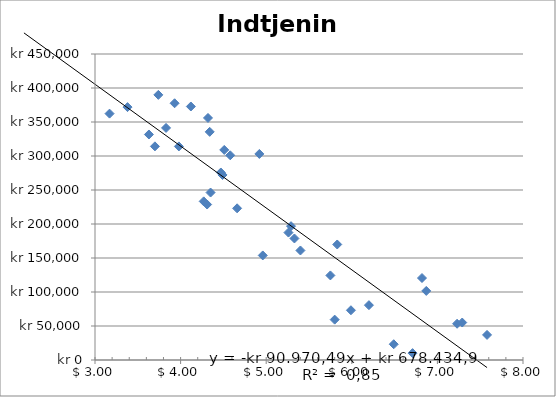
| Category | Indtjening |
|---|---|
| 7.23 | 53306 |
| 6.71 | 10131 |
| 6.49 | 23175 |
| 7.58 | 36888 |
| 7.29 | 55106 |
| 5.99 | 73177 |
| 5.8 | 59362 |
| 6.82 | 120555 |
| 6.87 | 101578 |
| 6.2 | 80640 |
| 5.83 | 169873 |
| 5.75 | 124362 |
| 4.96 | 153757 |
| 5.26 | 187387 |
| 5.4 | 161068 |
| 5.33 | 178734 |
| 4.66 | 223064 |
| 5.29 | 196829 |
| 4.35 | 246260 |
| 4.51 | 308921 |
| 4.31 | 228649 |
| 3.98 | 314065 |
| 3.7 | 314181 |
| 3.38 | 371908 |
| 3.93 | 377566 |
| 4.47 | 275740 |
| 4.58 | 301016 |
| 3.63 | 331629 |
| 4.92 | 303011 |
| 4.27 | 233286 |
| 4.32 | 355934 |
| 4.49 | 272118 |
| 4.34 | 335522 |
| 3.83 | 341283 |
| 4.12 | 372800 |
| 3.17 | 362334 |
| 3.74 | 389912 |